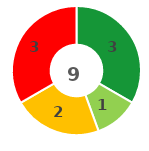
| Category | Series 0 |
|---|---|
| 0 | 3 |
| 1 | 1 |
| 2 | 2 |
| 3 | 3 |
| 4 | 0 |